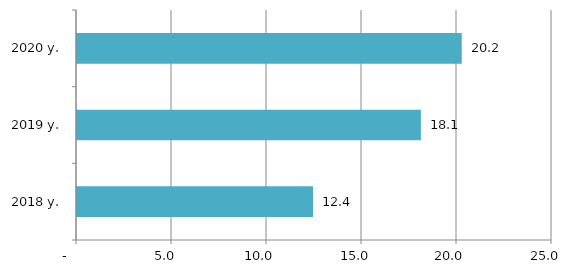
| Category | Series 0 |
|---|---|
| 2018 y. | 12.422 |
| 2019 y. | 18.098 |
| 2020 y. | 20.25 |